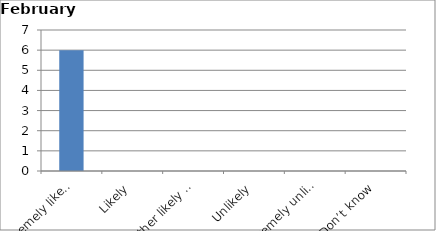
| Category | Series 0 |
|---|---|
| Extremely likely | 6 |
| Likely | 0 |
| Neither likely nor unlikely | 0 |
| Unlikely | 0 |
| Extremely unlikely | 0 |
| Don’t know | 0 |